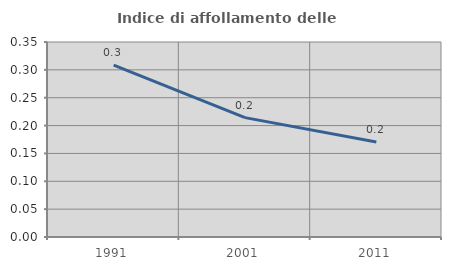
| Category | Indice di affollamento delle abitazioni  |
|---|---|
| 1991.0 | 0.308 |
| 2001.0 | 0.214 |
| 2011.0 | 0.171 |